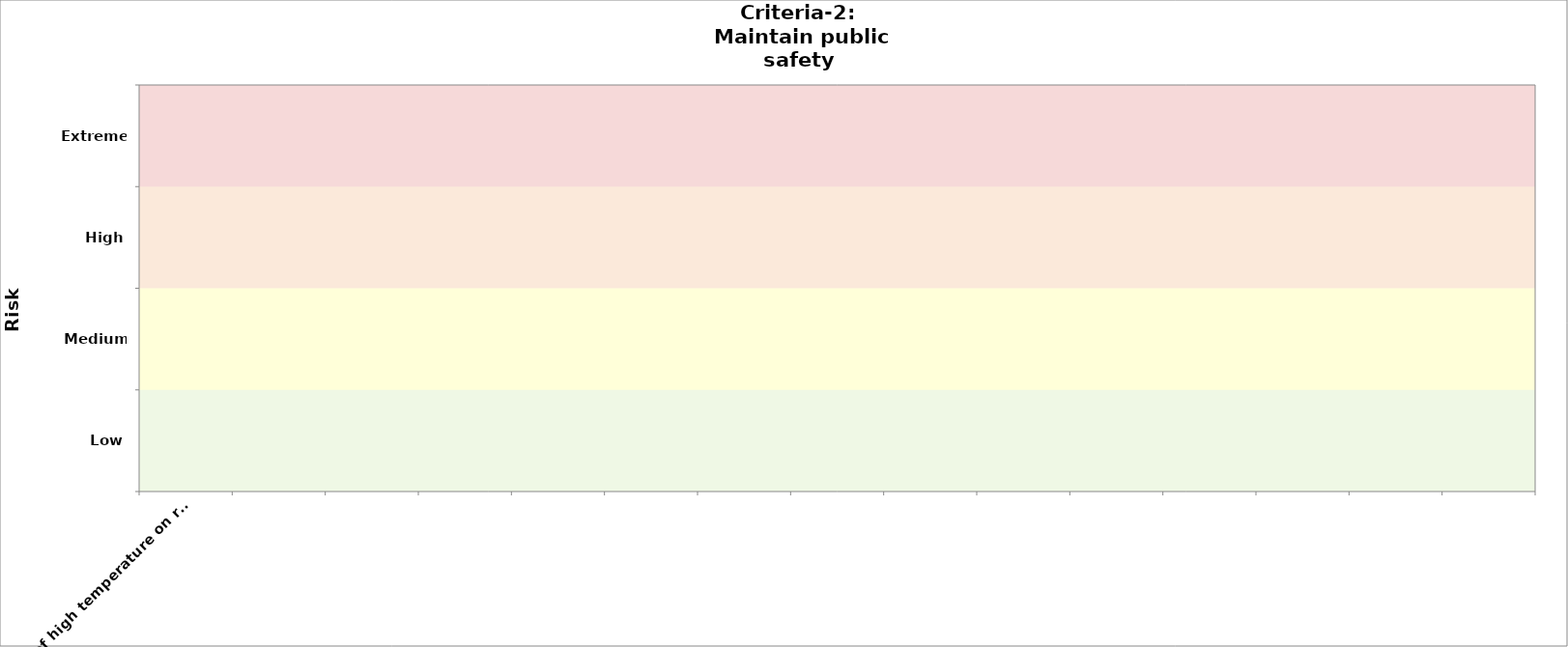
| Category | Criteria-3 (public health) | Criteria-2 2030 |
|---|---|---|
| e.g. effect of high temperature on road pavement  |  | 0 |